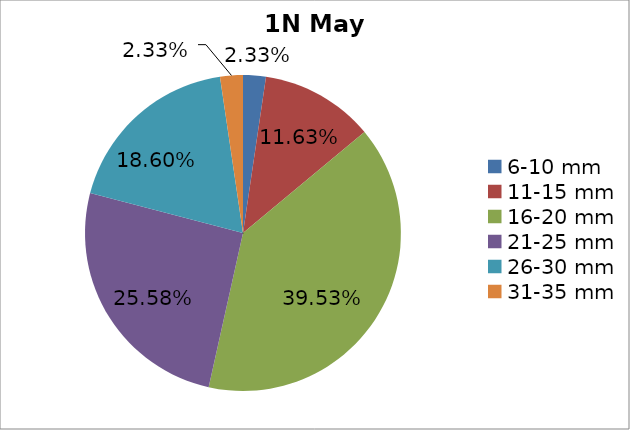
| Category | Series 0 |
|---|---|
| 6-10 mm | 0.023 |
| 11-15 mm | 0.116 |
| 16-20 mm | 0.395 |
| 21-25 mm | 0.256 |
| 26-30 mm | 0.186 |
| 31-35 mm | 0.023 |